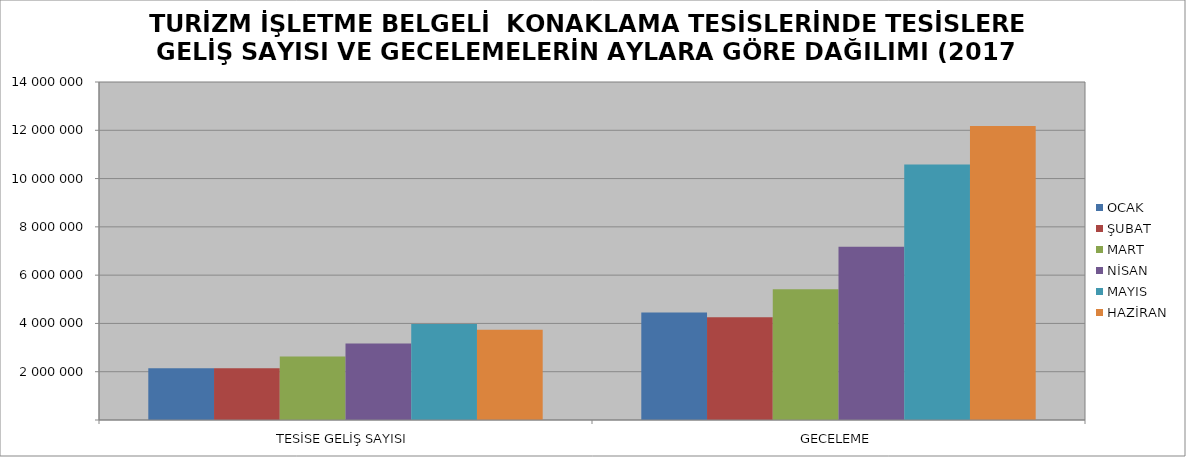
| Category | OCAK | ŞUBAT | MART | NİSAN | MAYIS | HAZİRAN |
|---|---|---|---|---|---|---|
| TESİSE GELİŞ SAYISI | 2146994 | 2141043 | 2629734 | 3173381 | 3978651 | 3742131 |
| GECELEME | 4457352 | 4260377 | 5413903 | 7176325 | 10579158 | 12172370 |